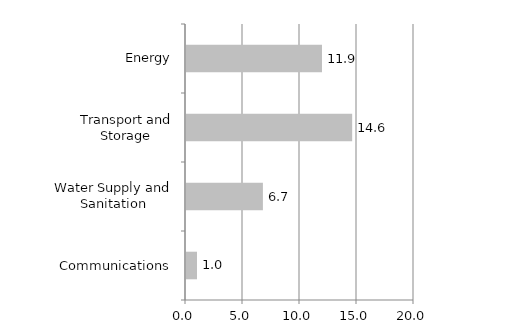
| Category | Series 0 |
|---|---|
| Communications | 0.963 |
| Water Supply and Sanitation | 6.746 |
| Transport and Storage | 14.576 |
| Energy | 11.929 |